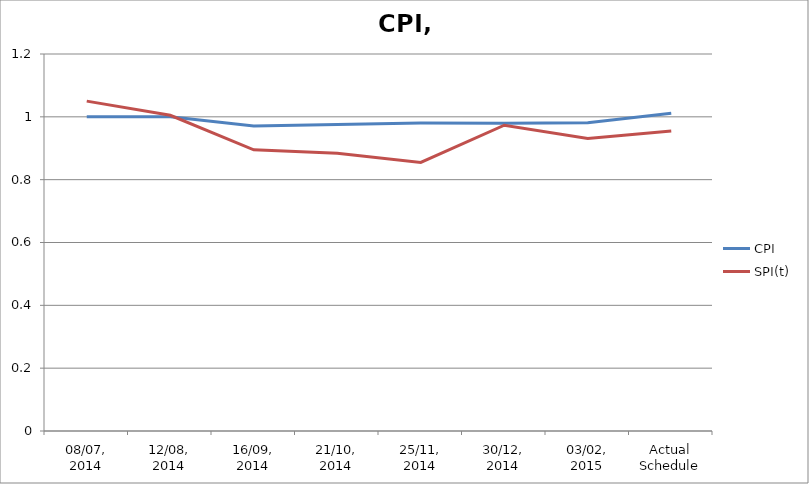
| Category | CPI | SPI(t) |
|---|---|---|
| 08/07, 2014 | 1 | 1.05 |
| 12/08, 2014 | 1 | 1.005 |
| 16/09, 2014 | 0.971 | 0.895 |
| 21/10, 2014 | 0.976 | 0.884 |
| 25/11, 2014 | 0.98 | 0.855 |
| 30/12, 2014 | 0.979 | 0.973 |
| 03/02, 2015 | 0.981 | 0.931 |
| Actual Schedule | 1.012 | 0.955 |